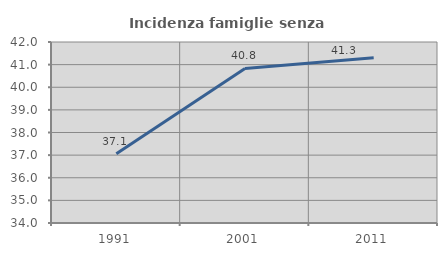
| Category | Incidenza famiglie senza nuclei |
|---|---|
| 1991.0 | 37.061 |
| 2001.0 | 40.833 |
| 2011.0 | 41.304 |